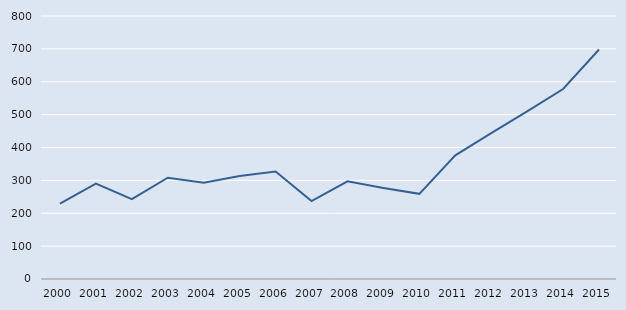
| Category | Series 0 |
|---|---|
| 2000.0 | 229 |
| 2001.0 | 290 |
| 2002.0 | 243 |
| 2003.0 | 308 |
| 2004.0 | 293 |
| 2005.0 | 313 |
| 2006.0 | 327 |
| 2007.0 | 237 |
| 2008.0 | 297 |
| 2009.0 | 277 |
| 2010.0 | 259 |
| 2011.0 | 376 |
| 2012.0 | 444 |
| 2013.0 | 510 |
| 2014.0 | 578 |
| 2015.0 | 698 |